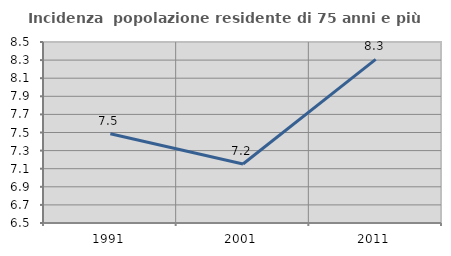
| Category | Incidenza  popolazione residente di 75 anni e più |
|---|---|
| 1991.0 | 7.485 |
| 2001.0 | 7.151 |
| 2011.0 | 8.309 |